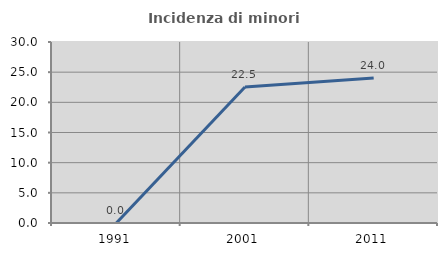
| Category | Incidenza di minori stranieri |
|---|---|
| 1991.0 | 0 |
| 2001.0 | 22.535 |
| 2011.0 | 24.031 |